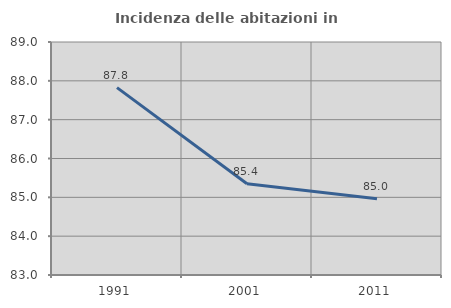
| Category | Incidenza delle abitazioni in proprietà  |
|---|---|
| 1991.0 | 87.826 |
| 2001.0 | 85.351 |
| 2011.0 | 84.961 |